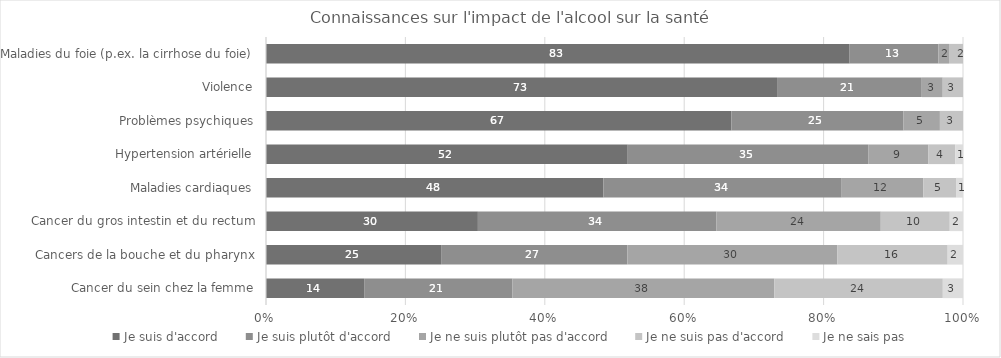
| Category | Je suis d'accord | Je suis plutôt d'accord | Je ne suis plutôt pas d'accord | Je ne suis pas d'accord | Je ne sais pas |
|---|---|---|---|---|---|
| Maladies du foie (p.ex. la cirrhose du foie) | 83.4 | 12.7 | 1.5 | 2 | 0 |
| Violence | 73.1 | 20.7 | 3 | 2.9 | 0 |
| Problèmes psychiques | 66.5 | 24.6 | 5.2 | 3.3 | 0 |
| Hypertension artérielle | 51.9 | 34.5 | 8.6 | 3.9 | 1.1 |
| Maladies cardiaques | 48.4 | 34.2 | 11.7 | 4.7 | 1 |
| Cancer du gros intestin et du rectum | 30.4 | 34.2 | 23.6 | 9.9 | 1.9 |
| Cancers de la bouche et du pharynx | 25.1 | 26.7 | 30.1 | 15.8 | 2.2 |
| Cancer du sein chez la femme | 14.1 | 21.3 | 37.6 | 24.2 | 2.9 |